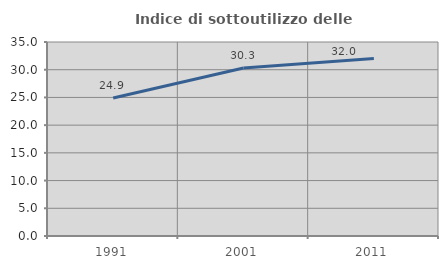
| Category | Indice di sottoutilizzo delle abitazioni  |
|---|---|
| 1991.0 | 24.898 |
| 2001.0 | 30.323 |
| 2011.0 | 32.021 |